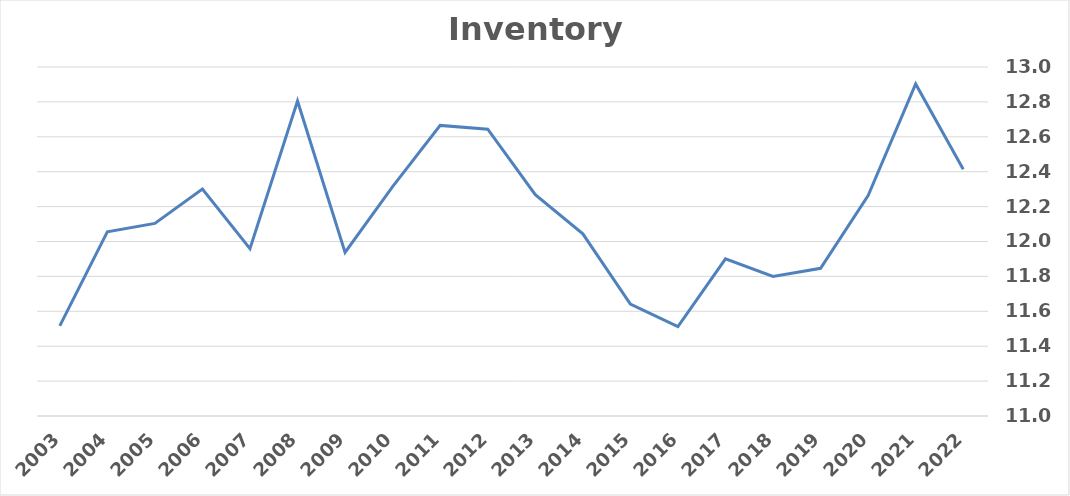
| Category | Inventory Turnover |
|---|---|
| 2022.0 | 12.414 |
| 2021.0 | 12.903 |
| 2020.0 | 12.264 |
| 2019.0 | 11.846 |
| 2018.0 | 11.8 |
| 2017.0 | 11.9 |
| 2016.0 | 11.512 |
| 2015.0 | 11.641 |
| 2014.0 | 12.044 |
| 2013.0 | 12.268 |
| 2012.0 | 12.644 |
| 2011.0 | 12.665 |
| 2010.0 | 12.315 |
| 2009.0 | 11.937 |
| 2008.0 | 12.805 |
| 2007.0 | 11.959 |
| 2006.0 | 12.301 |
| 2005.0 | 12.104 |
| 2004.0 | 12.056 |
| 2003.0 | 11.516 |